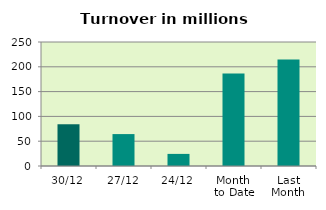
| Category | Series 0 |
|---|---|
| 30/12 | 84.151 |
| 27/12 | 64.345 |
| 24/12 | 24.394 |
| Month 
to Date | 186.73 |
| Last
Month | 214.794 |